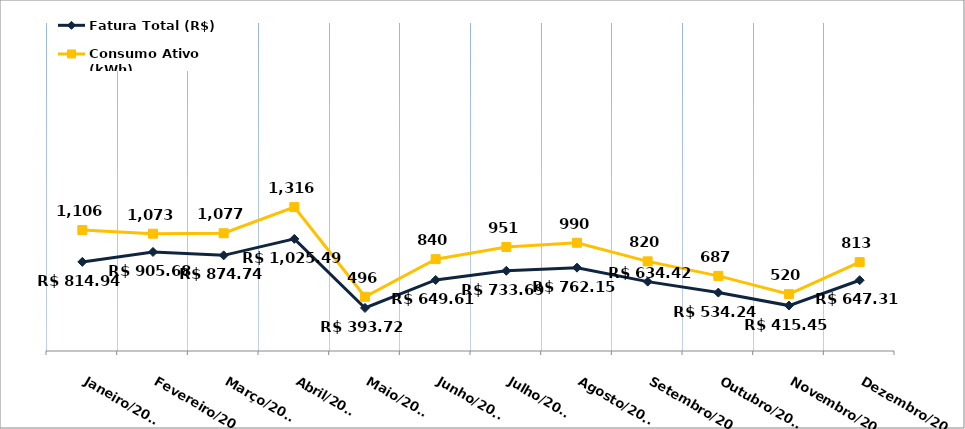
| Category | Fatura Total (R$) |
|---|---|
| Janeiro/2023 | 814.94 |
| Fevereiro/2023 | 905.68 |
| Março/2023 | 874.74 |
| Abril/2023 | 1025.49 |
| Maio/2023 | 393.72 |
| Junho/2023 | 649.61 |
| Julho/2023 | 733.69 |
| Agosto/2023 | 762.15 |
| Setembro/2023 | 634.42 |
| Outubro/2023 | 534.24 |
| Novembro/2023 | 415.45 |
| Dezembro/2023 | 647.31 |